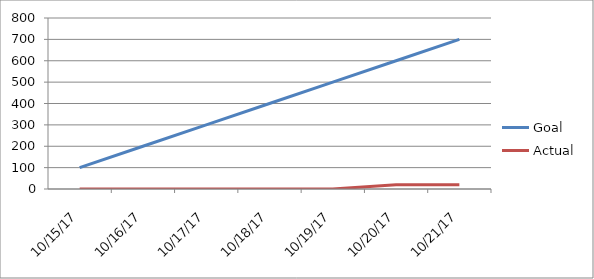
| Category | Goal | Actual |
|---|---|---|
| 2017-10-15 | 100 | 0 |
| 2017-10-16 | 200 | 0 |
| 2017-10-17 | 300 | 0 |
| 2017-10-18 | 400 | 0 |
| 2017-10-19 | 500 | 0 |
| 2017-10-20 | 600 | 20 |
| 2017-10-21 | 700 | 20 |